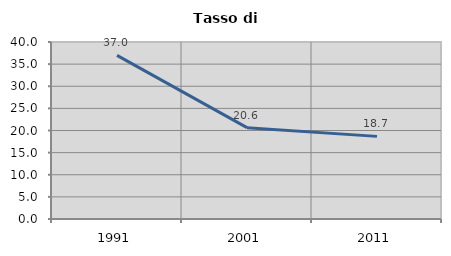
| Category | Tasso di disoccupazione   |
|---|---|
| 1991.0 | 36.984 |
| 2001.0 | 20.641 |
| 2011.0 | 18.673 |